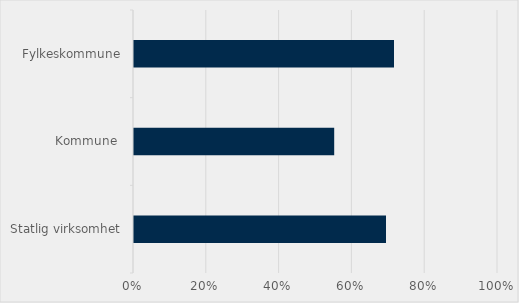
| Category | Prosent |
|---|---|
| Statlig virksomhet | 0.692 |
| Kommune  | 0.55 |
| Fylkeskommune | 0.714 |